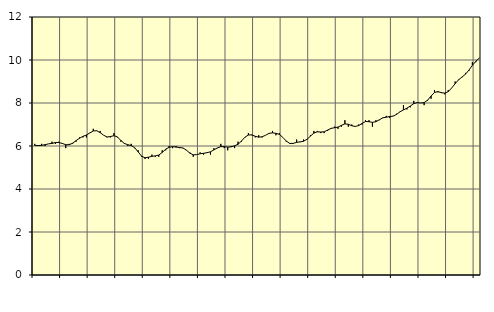
| Category | Piggar | Offentlig förvaltning m.m., SNI 84, 99 |
|---|---|---|
| nan | 6.1 | 6.03 |
| 87.0 | 6 | 6.02 |
| 87.0 | 6.1 | 6.03 |
| 87.0 | 6 | 6.06 |
| nan | 6.1 | 6.1 |
| 88.0 | 6.2 | 6.12 |
| 88.0 | 6.1 | 6.16 |
| 88.0 | 6.2 | 6.16 |
| nan | 6.1 | 6.12 |
| 89.0 | 5.9 | 6.06 |
| 89.0 | 6.1 | 6.06 |
| 89.0 | 6.1 | 6.13 |
| nan | 6.2 | 6.25 |
| 90.0 | 6.4 | 6.36 |
| 90.0 | 6.4 | 6.45 |
| 90.0 | 6.4 | 6.51 |
| nan | 6.6 | 6.61 |
| 91.0 | 6.8 | 6.7 |
| 91.0 | 6.7 | 6.71 |
| 91.0 | 6.7 | 6.62 |
| nan | 6.5 | 6.5 |
| 92.0 | 6.4 | 6.42 |
| 92.0 | 6.4 | 6.44 |
| 92.0 | 6.6 | 6.48 |
| nan | 6.4 | 6.42 |
| 93.0 | 6.2 | 6.26 |
| 93.0 | 6.1 | 6.12 |
| 93.0 | 6 | 6.06 |
| nan | 6.1 | 6.02 |
| 94.0 | 5.9 | 5.92 |
| 94.0 | 5.8 | 5.73 |
| 94.0 | 5.5 | 5.53 |
| nan | 5.4 | 5.45 |
| 95.0 | 5.4 | 5.48 |
| 95.0 | 5.6 | 5.52 |
| 95.0 | 5.5 | 5.54 |
| nan | 5.5 | 5.58 |
| 96.0 | 5.8 | 5.7 |
| 96.0 | 5.8 | 5.85 |
| 96.0 | 6 | 5.94 |
| nan | 5.9 | 5.97 |
| 97.0 | 6 | 5.95 |
| 97.0 | 5.9 | 5.93 |
| 97.0 | 5.9 | 5.91 |
| nan | 5.8 | 5.81 |
| 98.0 | 5.7 | 5.67 |
| 98.0 | 5.5 | 5.59 |
| 98.0 | 5.6 | 5.6 |
| nan | 5.7 | 5.64 |
| 99.0 | 5.6 | 5.66 |
| 99.0 | 5.7 | 5.69 |
| 99.0 | 5.6 | 5.73 |
| nan | 5.9 | 5.82 |
| 0.0 | 5.9 | 5.91 |
| 0.0 | 6.1 | 5.97 |
| 0.0 | 5.9 | 5.97 |
| nan | 5.8 | 5.95 |
| 1.0 | 6 | 5.96 |
| 1.0 | 5.9 | 6.01 |
| 1.0 | 6.2 | 6.08 |
| nan | 6.2 | 6.23 |
| 2.0 | 6.4 | 6.41 |
| 2.0 | 6.6 | 6.51 |
| 2.0 | 6.5 | 6.52 |
| nan | 6.4 | 6.45 |
| 3.0 | 6.5 | 6.41 |
| 3.0 | 6.4 | 6.43 |
| 3.0 | 6.5 | 6.5 |
| nan | 6.6 | 6.59 |
| 4.0 | 6.7 | 6.61 |
| 4.0 | 6.5 | 6.59 |
| 4.0 | 6.6 | 6.54 |
| nan | 6.4 | 6.4 |
| 5.0 | 6.2 | 6.23 |
| 5.0 | 6.1 | 6.12 |
| 5.0 | 6.1 | 6.12 |
| nan | 6.3 | 6.17 |
| 6.0 | 6.2 | 6.19 |
| 6.0 | 6.3 | 6.22 |
| 6.0 | 6.3 | 6.31 |
| nan | 6.5 | 6.46 |
| 7.0 | 6.7 | 6.6 |
| 7.0 | 6.7 | 6.66 |
| 7.0 | 6.6 | 6.65 |
| nan | 6.6 | 6.66 |
| 8.0 | 6.7 | 6.74 |
| 8.0 | 6.8 | 6.82 |
| 8.0 | 6.9 | 6.85 |
| nan | 6.8 | 6.88 |
| 9.0 | 6.9 | 6.96 |
| 9.0 | 7.2 | 7.03 |
| 9.0 | 6.9 | 7.01 |
| nan | 7 | 6.94 |
| 10.0 | 6.9 | 6.91 |
| 10.0 | 7 | 6.95 |
| 10.0 | 7 | 7.05 |
| nan | 7.2 | 7.14 |
| 11.0 | 7.2 | 7.13 |
| 11.0 | 6.9 | 7.1 |
| 11.0 | 7.2 | 7.13 |
| nan | 7.2 | 7.22 |
| 12.0 | 7.3 | 7.31 |
| 12.0 | 7.4 | 7.34 |
| 12.0 | 7.3 | 7.37 |
| nan | 7.4 | 7.39 |
| 13.0 | 7.5 | 7.47 |
| 13.0 | 7.6 | 7.59 |
| 13.0 | 7.9 | 7.68 |
| nan | 7.7 | 7.76 |
| 14.0 | 7.8 | 7.86 |
| 14.0 | 8.1 | 7.97 |
| 14.0 | 8 | 8.02 |
| nan | 8 | 8 |
| 15.0 | 7.9 | 8.02 |
| 15.0 | 8.1 | 8.13 |
| 15.0 | 8.2 | 8.32 |
| nan | 8.6 | 8.49 |
| 16.0 | 8.5 | 8.53 |
| 16.0 | 8.5 | 8.48 |
| 16.0 | 8.4 | 8.46 |
| nan | 8.6 | 8.53 |
| 17.0 | 8.7 | 8.7 |
| 17.0 | 9 | 8.9 |
| 17.0 | 9.1 | 9.08 |
| nan | 9.2 | 9.21 |
| 18.0 | 9.4 | 9.34 |
| 18.0 | 9.5 | 9.53 |
| 18.0 | 9.9 | 9.75 |
| nan | 9.9 | 9.94 |
| 19.0 | 10.1 | 10.09 |